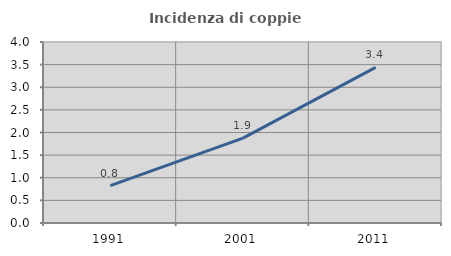
| Category | Incidenza di coppie miste |
|---|---|
| 1991.0 | 0.824 |
| 2001.0 | 1.877 |
| 2011.0 | 3.439 |